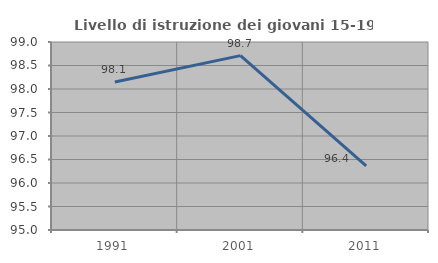
| Category | Livello di istruzione dei giovani 15-19 anni |
|---|---|
| 1991.0 | 98.148 |
| 2001.0 | 98.71 |
| 2011.0 | 96.364 |